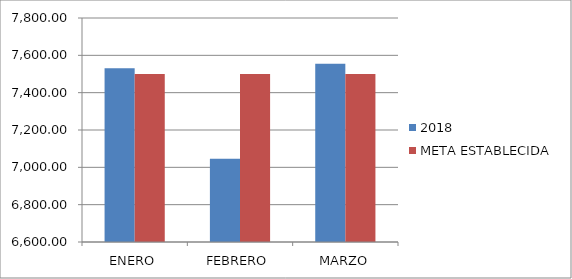
| Category | 2018 | META ESTABLECIDA |
|---|---|---|
| ENERO | 7531.04 | 7500 |
| FEBRERO | 7045.65 | 7500 |
| MARZO | 7555.52 | 7500 |